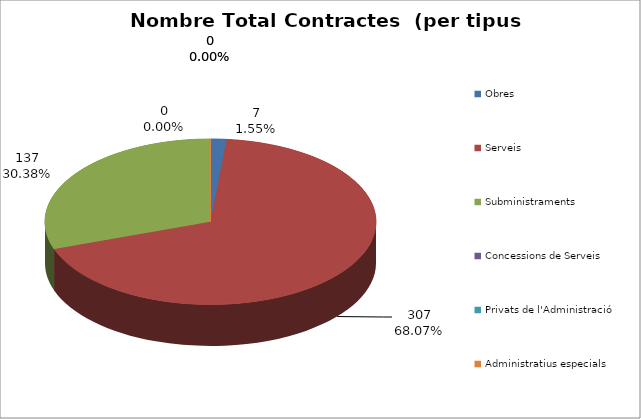
| Category | Nombre Total Contractes |
|---|---|
| Obres | 7 |
| Serveis | 307 |
| Subministraments | 137 |
| Concessions de Serveis | 0 |
| Privats de l'Administració | 0 |
| Administratius especials | 0 |